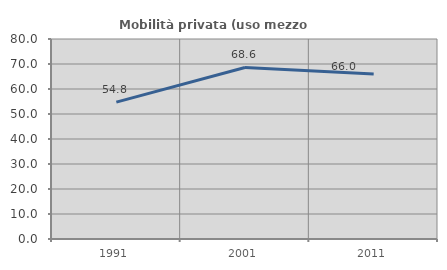
| Category | Mobilità privata (uso mezzo privato) |
|---|---|
| 1991.0 | 54.76 |
| 2001.0 | 68.613 |
| 2011.0 | 66.049 |